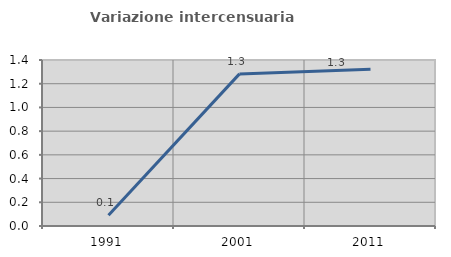
| Category | Variazione intercensuaria annua |
|---|---|
| 1991.0 | 0.091 |
| 2001.0 | 1.283 |
| 2011.0 | 1.322 |